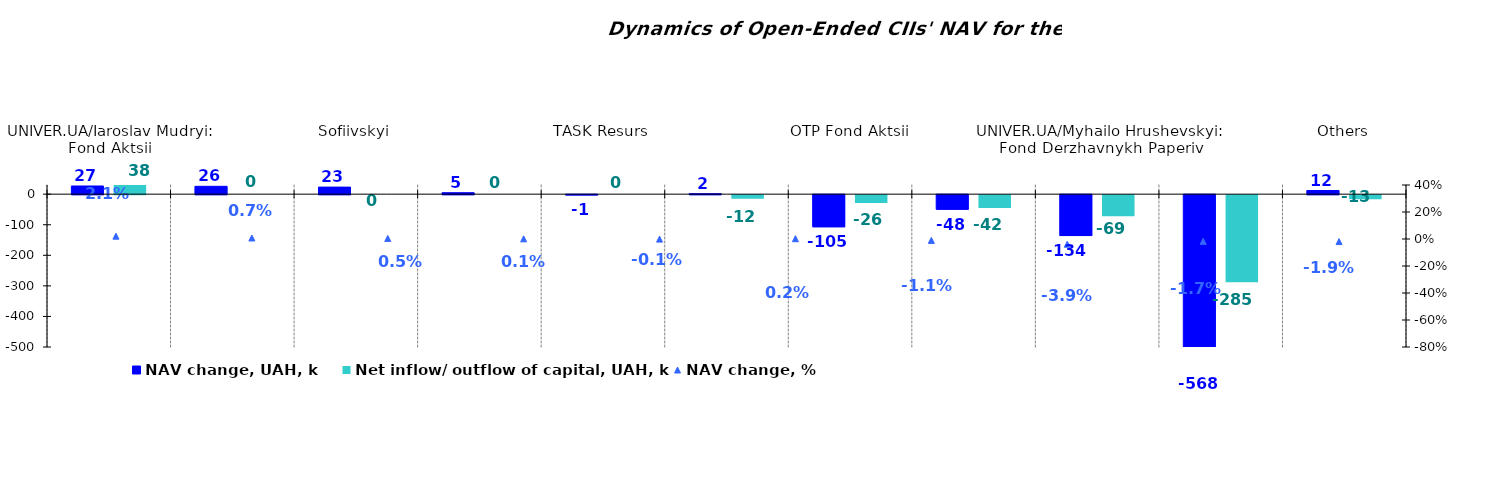
| Category | NAV change, UAH, k | Net inflow/ outflow of capital, UAH, k |
|---|---|---|
| UNIVER.UA/Iaroslav Mudryi: Fond Aktsii | 26.756 | 38.057 |
| Altus – Zbalansovanyi | 25.746 | 0 |
| Sofiivskyi | 23.097 | 0 |
| Altus – Depozyt | 4.8 | 0 |
| ТАSK Resurs | -0.978 | 0 |
| Nadbannia | 1.665 | -11.946 |
| OTP Fond Aktsii | -104.933 | -25.831 |
| UNIVER.UA/Taras Shevchenko: Fond Zaoshchadzhen | -47.661 | -41.975 |
| UNIVER.UA/Myhailo Hrushevskyi: Fond Derzhavnykh Paperiv | -133.809 | -69.24 |
| КІNТО-Klasychnyi | -567.637 | -285.136 |
| Others | 11.983 | -13.067 |